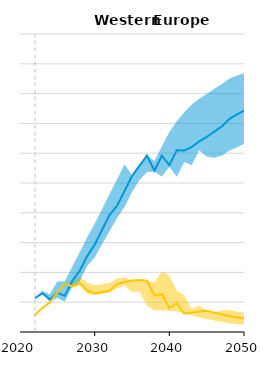
| Category | BEV_ref | PHEV_ref |
|---|---|---|
| 2022.0 | 0.114 | 0.057 |
| 2023.0 | 0.13 | 0.081 |
| 2024.0 | 0.109 | 0.099 |
| 2025.0 | 0.131 | 0.132 |
| 2026.0 | 0.122 | 0.162 |
| 2027.0 | 0.172 | 0.154 |
| 2028.0 | 0.205 | 0.165 |
| 2029.0 | 0.255 | 0.139 |
| 2030.0 | 0.293 | 0.13 |
| 2031.0 | 0.343 | 0.134 |
| 2032.0 | 0.393 | 0.138 |
| 2033.0 | 0.424 | 0.161 |
| 2034.0 | 0.474 | 0.167 |
| 2035.0 | 0.523 | 0.173 |
| 2036.0 | 0.558 | 0.175 |
| 2037.0 | 0.592 | 0.172 |
| 2038.0 | 0.542 | 0.122 |
| 2039.0 | 0.592 | 0.128 |
| 2040.0 | 0.56 | 0.08 |
| 2041.0 | 0.61 | 0.096 |
| 2042.0 | 0.609 | 0.062 |
| 2043.0 | 0.621 | 0.065 |
| 2044.0 | 0.64 | 0.069 |
| 2045.0 | 0.654 | 0.071 |
| 2046.0 | 0.672 | 0.065 |
| 2047.0 | 0.689 | 0.059 |
| 2048.0 | 0.714 | 0.054 |
| 2049.0 | 0.729 | 0.049 |
| 2050.0 | 0.743 | 0.045 |